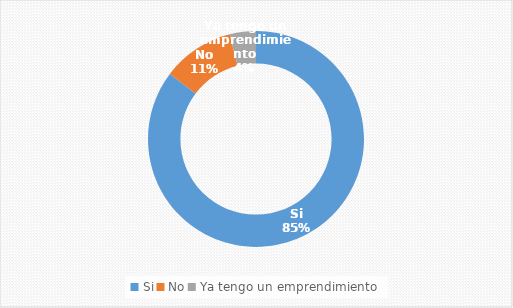
| Category | Series 0 |
|---|---|
| Si | 0.853 |
| No | 0.108 |
| Ya tengo un emprendimiento | 0.039 |